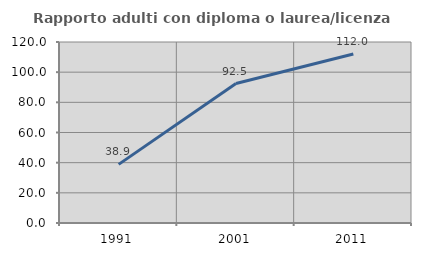
| Category | Rapporto adulti con diploma o laurea/licenza media  |
|---|---|
| 1991.0 | 38.875 |
| 2001.0 | 92.466 |
| 2011.0 | 111.991 |